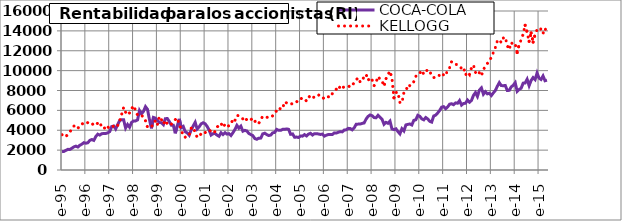
| Category | COCA-COLA | KELLOGG |
|---|---|---|
| 1995-01-01 | 1844.27 | 3550.07 |
| 1995-02-01 | 1871.13 | 3328.67 |
| 1995-03-01 | 1978.57 | 3389.24 |
| 1995-04-01 | 2076.37 | 3589.06 |
| 1995-05-01 | 2071.87 | 3834.99 |
| 1995-06-01 | 2193.22 | 4180.45 |
| 1995-07-01 | 2327.49 | 4419.99 |
| 1995-08-01 | 2399.66 | 4435.45 |
| 1995-09-01 | 2313.96 | 4181.42 |
| 1995-10-01 | 2493.66 | 4523.39 |
| 1995-11-01 | 2597.76 | 4585.57 |
| 1995-12-01 | 2751.7 | 4811.86 |
| 1996-01-01 | 2696.1 | 4827.48 |
| 1996-02-01 | 2741.49 | 4757.18 |
| 1996-03-01 | 2982.05 | 4836.59 |
| 1996-04-01 | 3068.64 | 4726.67 |
| 1996-05-01 | 2977.58 | 4467.57 |
| 1996-06-01 | 3369.13 | 4617.86 |
| 1996-07-01 | 3606.5 | 4704.69 |
| 1996-08-01 | 3515.19 | 4838.88 |
| 1996-09-01 | 3652.15 | 4287.72 |
| 1996-10-01 | 3670.1 | 4335.36 |
| 1996-11-01 | 3679.25 | 4057.46 |
| 1996-12-01 | 3734.1 | 4330.09 |
| 1997-01-01 | 3862.55 | 4194.27 |
| 1997-02-01 | 4367.15 | 4386.01 |
| 1997-03-01 | 4431.38 | 4396.44 |
| 1997-04-01 | 4128.89 | 4267.84 |
| 1997-05-01 | 4570.29 | 4460.74 |
| 1997-06-01 | 4974.9 | 4931.05 |
| 1997-07-01 | 5058.8 | 5597.95 |
| 1997-08-01 | 5058.8 | 6301.23 |
| 1997-09-01 | 4224.88 | 5816.04 |
| 1997-10-01 | 4577.21 | 5539.86 |
| 1997-11-01 | 4304.7 | 5751.05 |
| 1997-12-01 | 4781.91 | 6163.16 |
| 1998-01-01 | 4939.3 | 6481.52 |
| 1998-02-01 | 4939.3 | 6008.06 |
| 1998-03-01 | 5036.52 | 5539.16 |
| 1998-04-01 | 5983.97 | 5621.21 |
| 1998-05-01 | 5654.62 | 5465.3 |
| 1998-06-01 | 5900.47 | 5371.93 |
| 1998-07-01 | 6376.32 | 4951.09 |
| 1998-08-01 | 6106.77 | 4332.2 |
| 1998-09-01 | 5075.04 | 4222.83 |
| 1998-10-01 | 4192.77 | 4405.71 |
| 1998-11-01 | 5292.21 | 4488.83 |
| 1998-12-01 | 5219.25 | 4996.46 |
| 1999-01-01 | 5004.5 | 4569.63 |
| 1999-02-01 | 4780.42 | 5389.81 |
| 1999-03-01 | 4757.08 | 5086.98 |
| 1999-04-01 | 4562.64 | 4623.77 |
| 1999-05-01 | 5166.32 | 5002.77 |
| 1999-06-01 | 5175.68 | 4620.52 |
| 1999-07-01 | 4869.52 | 4476.39 |
| 1999-08-01 | 4508.29 | 4603.56 |
| 1999-09-01 | 4503.6 | 4865.53 |
| 1999-10-01 | 3693.27 | 5070.39 |
| 1999-11-01 | 4441.34 | 5241.11 |
| 1999-12-01 | 5145.2 | 4556.69 |
| 2000-01-01 | 4253.87 | 4109.62 |
| 2000-02-01 | 4385.92 | 3378.83 |
| 2000-03-01 | 3848.29 | 3305.18 |
| 2000-04-01 | 3735.42 | 3505.23 |
| 2000-05-01 | 3503.43 | 3496.53 |
| 2000-06-01 | 4033.68 | 4209.7 |
| 2000-07-01 | 4435.95 | 4314.95 |
| 2000-08-01 | 4796.91 | 3788.73 |
| 2000-09-01 | 4122.49 | 3279.48 |
| 2000-10-01 | 4345.42 | 3385.84 |
| 2000-11-01 | 4640.84 | 3642.88 |
| 2000-12-01 | 4753.87 | 3553.81 |
| 2001-01-01 | 4658.31 | 3759.7 |
| 2001-02-01 | 4390.95 | 3864.25 |
| 2001-03-01 | 4028.6 | 4036.28 |
| 2001-04-01 | 3517.9 | 3868.58 |
| 2001-05-01 | 3654.48 | 3699.44 |
| 2001-06-01 | 3668.29 | 3885.19 |
| 2001-07-01 | 3512.46 | 4336.18 |
| 2001-08-01 | 3395.38 | 4452.94 |
| 2001-09-01 | 3748.93 | 4705.77 |
| 2001-10-01 | 3562.93 | 4286.54 |
| 2001-11-01 | 3756.19 | 4596.92 |
| 2001-12-01 | 3610.79 | 4348.32 |
| 2002-01-01 | 3658.91 | 4465.52 |
| 2002-02-01 | 3467.23 | 4558.99 |
| 2002-03-01 | 3756.68 | 5155.7 |
| 2002-04-01 | 4075.48 | 4974.88 |
| 2002-05-01 | 4490.04 | 5487.45 |
| 2002-06-01 | 4210.29 | 5462.32 |
| 2002-07-01 | 4407.2 | 5361.5 |
| 2002-08-01 | 3905.08 | 5138.79 |
| 2002-09-01 | 3988.77 | 4876.39 |
| 2002-10-01 | 3930.57 | 5135.68 |
| 2002-11-01 | 3676.96 | 4982.54 |
| 2002-12-01 | 3564.82 | 5051.94 |
| 2003-01-01 | 3457.56 | 5235.25 |
| 2003-02-01 | 3166.54 | 4937.36 |
| 2003-03-01 | 3092.41 | 4623.32 |
| 2003-04-01 | 3203.89 | 4692.65 |
| 2003-05-01 | 3207.85 | 5067.01 |
| 2003-06-01 | 3633.03 | 5416.72 |
| 2003-07-01 | 3705.1 | 5363.95 |
| 2003-08-01 | 3566.43 | 5315.84 |
| 2003-09-01 | 3468.4 | 5243.35 |
| 2003-10-01 | 3515.19 | 5291.82 |
| 2003-11-01 | 3738.64 | 5457.58 |
| 2003-12-01 | 3783.62 | 5639.45 |
| 2004-01-01 | 4083.76 | 5996.93 |
| 2004-02-01 | 3992.03 | 5915.05 |
| 2004-03-01 | 3992.83 | 6272.53 |
| 2004-04-01 | 4091.2 | 6209.66 |
| 2004-05-01 | 4094.44 | 6865.81 |
| 2004-06-01 | 4130.84 | 6747.21 |
| 2004-07-01 | 4093.23 | 6595.75 |
| 2004-08-01 | 3593.36 | 6608.5 |
| 2004-09-01 | 3628.31 | 6701.15 |
| 2004-10-01 | 3295.51 | 6848.71 |
| 2004-11-01 | 3313.5 | 6826.25 |
| 2004-12-01 | 3271.83 | 7141.95 |
| 2005-01-01 | 3417.45 | 7154.86 |
| 2005-02-01 | 3407.57 | 7250.02 |
| 2005-03-01 | 3559.77 | 7200.5 |
| 2005-04-01 | 3426.72 | 6924.75 |
| 2005-05-01 | 3608.08 | 7283.23 |
| 2005-06-01 | 3692.55 | 7506.11 |
| 2005-07-01 | 3517.91 | 7281.02 |
| 2005-08-01 | 3656.26 | 7339.74 |
| 2005-09-01 | 3657.09 | 7409.71 |
| 2005-10-01 | 3624.35 | 7580.38 |
| 2005-11-01 | 3577.38 | 7334.21 |
| 2005-12-01 | 3616.68 | 7338.11 |
| 2006-01-01 | 3403.09 | 7136.66 |
| 2006-02-01 | 3503.56 | 7210.96 |
| 2006-03-01 | 3571.94 | 7363.85 |
| 2006-04-01 | 3560.58 | 7314 |
| 2006-05-01 | 3569.09 | 7686.19 |
| 2006-06-01 | 3734.91 | 7922.19 |
| 2006-07-01 | 3714.79 | 8131.11 |
| 2006-08-01 | 3795.3 | 7990.71 |
| 2006-09-01 | 3860.4 | 8492.25 |
| 2006-10-01 | 3838.06 | 8278.77 |
| 2006-11-01 | 4022.63 | 8367.86 |
| 2006-12-01 | 4043.29 | 8386.6 |
| 2007-01-01 | 4189.15 | 8464.38 |
| 2007-02-01 | 4176.13 | 8351.09 |
| 2007-03-01 | 4038.95 | 8451.63 |
| 2007-04-01 | 4243.03 | 8827.53 |
| 2007-05-01 | 4602.45 | 9077.55 |
| 2007-06-01 | 4617.31 | 9288.97 |
| 2007-07-01 | 4626.75 | 8851.2 |
| 2007-08-01 | 4689.25 | 8926.45 |
| 2007-09-01 | 4734.14 | 9446.73 |
| 2007-10-01 | 5127.86 | 9620.43 |
| 2007-11-01 | 5393.55 | 9016.79 |
| 2007-12-01 | 5538.41 | 9308.8 |
| 2008-01-01 | 5464.51 | 9068.38 |
| 2008-02-01 | 5276.63 | 8478.58 |
| 2008-03-01 | 5255.26 | 8824.5 |
| 2008-04-01 | 5505.86 | 9414.42 |
| 2008-05-01 | 5295.27 | 9123.81 |
| 2008-06-01 | 5107.98 | 8995.09 |
| 2008-07-01 | 4600.69 | 8410.36 |
| 2008-08-01 | 4793.74 | 9184.16 |
| 2008-09-01 | 4697.21 | 9589.87 |
| 2008-10-01 | 4920.04 | 9958.04 |
| 2008-11-01 | 4128.8 | 9214.66 |
| 2008-12-01 | 4060.78 | 7266.39 |
| 2009-01-01 | 4146.88 | 7788.59 |
| 2009-02-01 | 3869.33 | 7841.87 |
| 2009-03-01 | 3635.74 | 6801.31 |
| 2009-04-01 | 4151.9 | 6735.02 |
| 2009-05-01 | 3930.71 | 7776 |
| 2009-06-01 | 4536.92 | 7918.3 |
| 2009-07-01 | 4590.15 | 8586.44 |
| 2009-08-01 | 4629.35 | 8478.09 |
| 2009-09-01 | 4529.48 | 8544.61 |
| 2009-10-01 | 4997.34 | 8897.76 |
| 2009-11-01 | 5053.79 | 9420.19 |
| 2009-12-01 | 5503.14 | 9711.04 |
| 2010-01-01 | 5400.81 | 9753.21 |
| 2010-02-01 | 5152.56 | 10031.87 |
| 2010-03-01 | 5047.39 | 9631.3 |
| 2010-04-01 | 5282.75 | 9899.04 |
| 2010-05-01 | 5135.63 | 10107.7 |
| 2010-06-01 | 4899.68 | 9964.6 |
| 2010-07-01 | 4820.02 | 9440.24 |
| 2010-08-01 | 5434.69 | 9297.07 |
| 2010-09-01 | 5521.4 | 9354.68 |
| 2010-10-01 | 5738.96 | 9544.02 |
| 2010-11-01 | 5990.39 | 9514.03 |
| 2010-12-01 | 6324.23 | 9344.75 |
| 2011-01-01 | 6375.06 | 9616.93 |
| 2011-02-01 | 6162.95 | 9488.41 |
| 2011-03-01 | 6344.76 | 10092.07 |
| 2011-04-01 | 6618.2 | 10284.43 |
| 2011-05-01 | 6667.43 | 10907.2 |
| 2011-06-01 | 6572.91 | 10828.18 |
| 2011-07-01 | 6752.24 | 10626.77 |
| 2011-08-01 | 6716.54 | 10609.51 |
| 2011-09-01 | 6986.28 | 10435.13 |
| 2011-10-01 | 6531.59 | 10224.38 |
| 2011-11-01 | 6693.34 | 10355.86 |
| 2011-12-01 | 6719.75 | 9554.55 |
| 2012-01-01 | 7035.48 | 9864.72 |
| 2012-02-01 | 6822.31 | 9618.93 |
| 2012-03-01 | 6998.27 | 10278.16 |
| 2012-04-01 | 7508.89 | 10569.23 |
| 2012-05-01 | 7791.46 | 9833.68 |
| 2012-06-01 | 7402.55 | 9566.21 |
| 2012-07-01 | 8047.59 | 9810.23 |
| 2012-08-01 | 8260.71 | 9484.88 |
| 2012-09-01 | 7627.46 | 10135.74 |
| 2012-10-01 | 7880.48 | 10391.88 |
| 2012-11-01 | 7664.89 | 10706.06 |
| 2012-12-01 | 7727.26 | 11145.77 |
| 2013-01-01 | 7493.67 | 11264.77 |
| 2013-02-01 | 7760.34 | 11829.52 |
| 2013-03-01 | 8000.14 | 12307.66 |
| 2013-04-01 | 8422.57 | 12988.26 |
| 2013-05-01 | 8789.04 | 13126.41 |
| 2013-06-01 | 8497.53 | 12813.09 |
| 2013-07-01 | 8483.05 | 13275.45 |
| 2013-08-01 | 8506.12 | 13383.88 |
| 2013-09-01 | 8005.02 | 12514.58 |
| 2013-10-01 | 8014.75 | 12110.55 |
| 2013-11-01 | 8365.33 | 12840.28 |
| 2013-12-01 | 8523.56 | 12584.21 |
| 2014-01-01 | 8785.14 | 12683.91 |
| 2014-02-01 | 7911.09 | 11817.82 |
| 2014-03-01 | 8106.75 | 12600.83 |
| 2014-04-01 | 8233.18 | 13103.5 |
| 2014-05-01 | 8741.19 | 13678.95 |
| 2014-06-01 | 8758.33 | 14560.45 |
| 2014-07-01 | 9133.26 | 13873.71 |
| 2014-08-01 | 8485.36 | 12942.62 |
| 2014-09-01 | 9010.15 | 13789.8 |
| 2014-10-01 | 9297.55 | 12872.89 |
| 2014-11-01 | 9095.24 | 13605.15 |
| 2014-12-01 | 9758.04 | 14133.39 |
| 2015-01-01 | 9247.68 | 13994.38 |
| 2015-02-01 | 9109.69 | 14214.65 |
| 2015-03-01 | 9462.34 | 13748.45 |
| 2015-04-01 | 8982.84 | 14259.78 |
| 2015-05-01 | 9033.63 | 13766.36 |